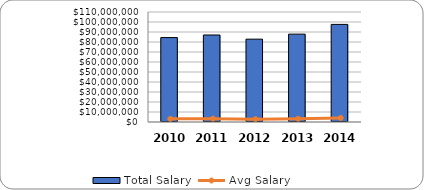
| Category | Total Salary |
|---|---|
| 2010.0 | 84423666 |
| 2011.0 | 87002692 |
| 2012.0 | 82829942 |
| 2013.0 | 87871525 |
| 2014.0 | 97609000 |